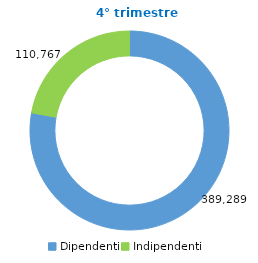
| Category | T4-2019 |
|---|---|
| Dipendenti | 389289 |
| Indipendenti | 110767 |